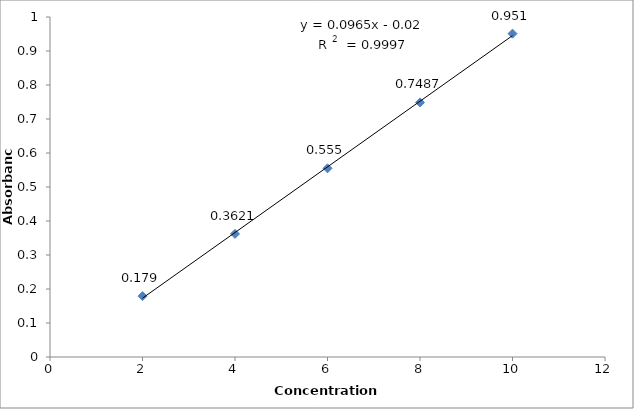
| Category | Series 0 |
|---|---|
| 2.0 | 0.179 |
| 4.0 | 0.362 |
| 6.0 | 0.555 |
| 8.0 | 0.749 |
| 10.0 | 0.951 |